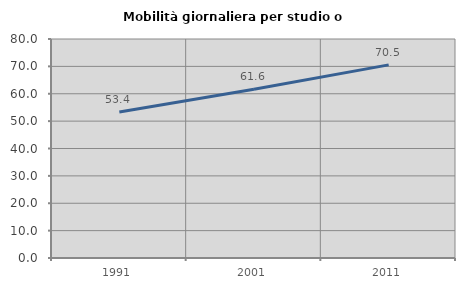
| Category | Mobilità giornaliera per studio o lavoro |
|---|---|
| 1991.0 | 53.364 |
| 2001.0 | 61.641 |
| 2011.0 | 70.544 |